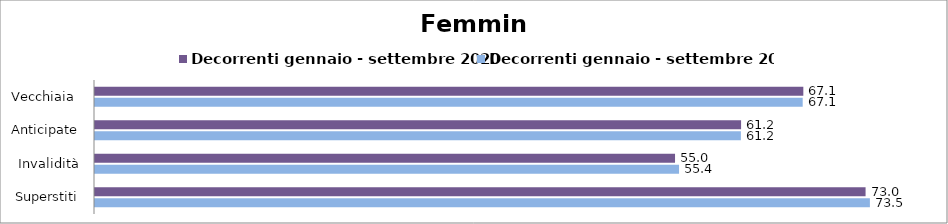
| Category | Decorrenti gennaio - settembre 2020 | Decorrenti gennaio - settembre 2021 |
|---|---|---|
| Vecchiaia  | 67.14 | 67.08 |
| Anticipate | 61.24 | 61.22 |
| Invalidità | 54.98 | 55.36 |
| Superstiti | 73.04 | 73.45 |